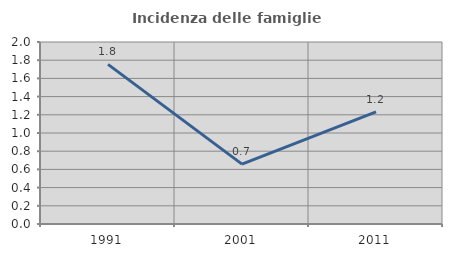
| Category | Incidenza delle famiglie numerose |
|---|---|
| 1991.0 | 1.754 |
| 2001.0 | 0.658 |
| 2011.0 | 1.232 |